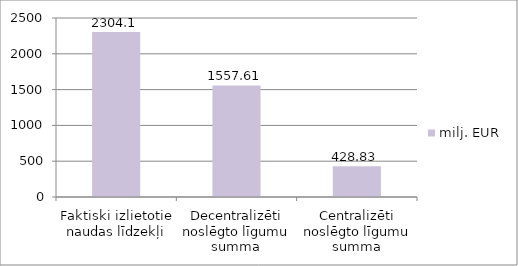
| Category | milj. EUR |
|---|---|
| Faktiski izlietotie naudas līdzekļi | 2304.1 |
| Decentralizēti noslēgto līgumu summa | 1557.61 |
| Centralizēti noslēgto līgumu summa | 428.83 |